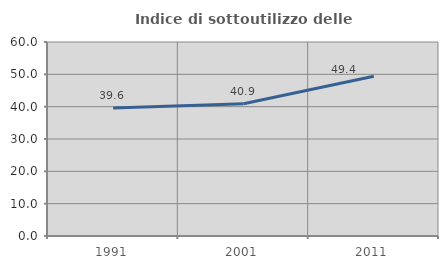
| Category | Indice di sottoutilizzo delle abitazioni  |
|---|---|
| 1991.0 | 39.595 |
| 2001.0 | 40.924 |
| 2011.0 | 49.429 |